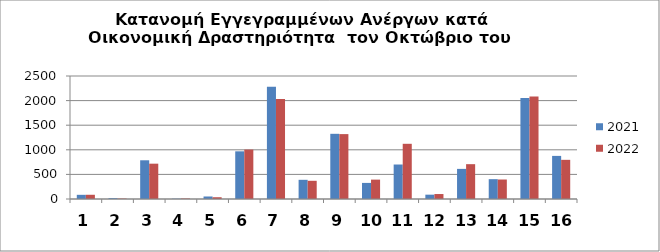
| Category | 2021 | 2022 |
|---|---|---|
| 0 | 85 | 86 |
| 1 | 17 | 9 |
| 2 | 787 | 718 |
| 3 | 6 | 10 |
| 4 | 51 | 36 |
| 5 | 969 | 1005 |
| 6 | 2283 | 2031 |
| 7 | 390 | 370 |
| 8 | 1325 | 1319 |
| 9 | 327 | 394 |
| 10 | 701 | 1122 |
| 11 | 88 | 101 |
| 12 | 612 | 708 |
| 13 | 403 | 396 |
| 14 | 2054 | 2082 |
| 15 | 876 | 796 |